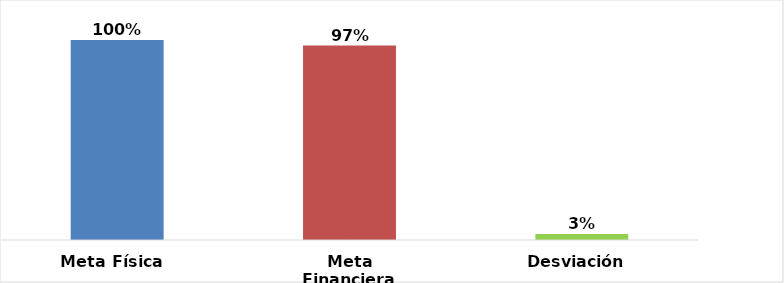
| Category | Meta Física  |
|---|---|
| Meta Física  | 1 |
| Meta Financiera | 0.972 |
| Desviación  | 0.03 |